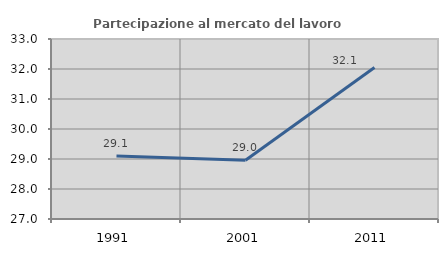
| Category | Partecipazione al mercato del lavoro  femminile |
|---|---|
| 1991.0 | 29.097 |
| 2001.0 | 28.956 |
| 2011.0 | 32.051 |